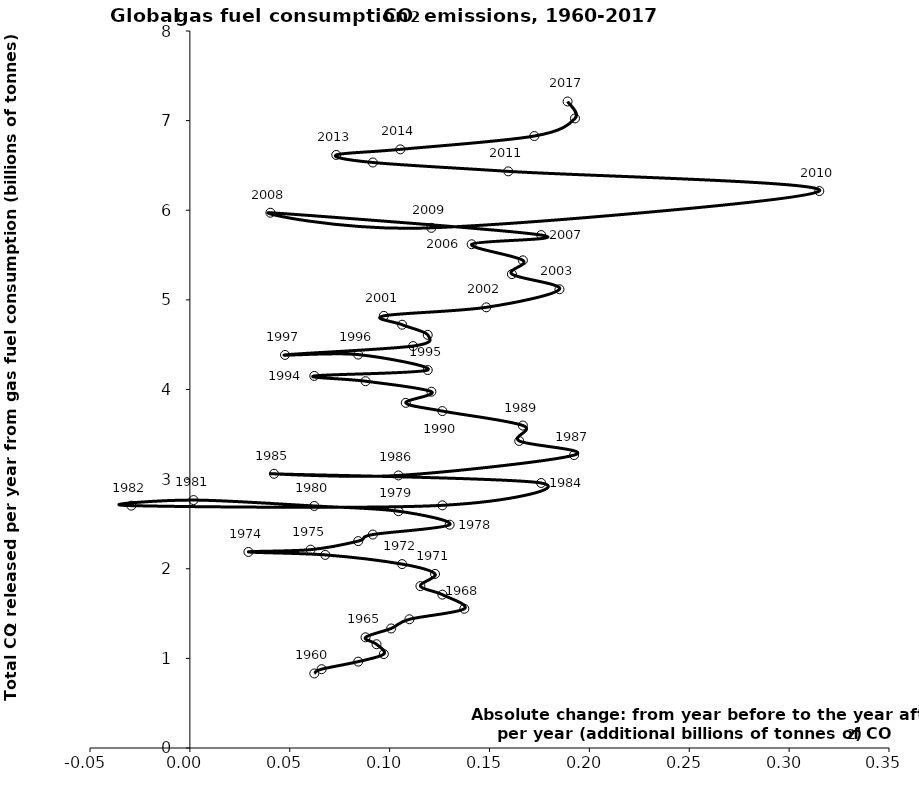
| Category | Series 0 |
|---|---|
| 0.06228800000000001 | 0.832 |
| 0.06595200000000001 | 0.879 |
| 0.08427199999999996 | 0.964 |
| 0.09709599999999996 | 1.048 |
| 0.09343200000000007 | 1.158 |
| 0.08793600000000001 | 1.235 |
| 0.10075999999999996 | 1.334 |
| 0.10992000000000002 | 1.436 |
| 0.13740000000000008 | 1.554 |
| 0.12640799999999996 | 1.711 |
| 0.11541599999999996 | 1.806 |
| 0.12274400000000019 | 1.942 |
| 0.1062559999999999 | 2.052 |
| 0.06778399999999984 | 2.154 |
| 0.029312000000000005 | 2.187 |
| 0.060456000000000065 | 2.213 |
| 0.08427200000000012 | 2.308 |
| 0.09160000000000013 | 2.382 |
| 0.13007199999999997 | 2.492 |
| 0.10442399999999985 | 2.642 |
| 0.06228800000000012 | 2.7 |
| 0.0018320000000000558 | 2.766 |
| -0.029312000000000227 | 2.704 |
| 0.12640800000000008 | 2.708 |
| 0.17587200000000003 | 2.957 |
| 0.04213599999999973 | 3.059 |
| 0.10442400000000007 | 3.041 |
| 0.1923600000000003 | 3.268 |
| 0.16487999999999992 | 3.426 |
| 0.16671199999999997 | 3.598 |
| 0.12640800000000008 | 3.759 |
| 0.10808799999999974 | 3.851 |
| 0.12091199999999991 | 3.975 |
| 0.08793600000000001 | 4.093 |
| 0.06228800000000012 | 4.151 |
| 0.11907999999999985 | 4.217 |
| 0.08427200000000035 | 4.389 |
| 0.04763200000000012 | 4.386 |
| 0.11175199999999963 | 4.485 |
| 0.11907999999999985 | 4.609 |
| 0.10625600000000013 | 4.723 |
| 0.09709600000000052 | 4.822 |
| 0.14839199999999986 | 4.917 |
| 0.18503200000000009 | 5.119 |
| 0.16121600000000047 | 5.287 |
| 0.16671199999999997 | 5.441 |
| 0.14106399999999963 | 5.621 |
| 0.17587199999999958 | 5.723 |
| 0.04030400000000034 | 5.972 |
| 0.12091200000000013 | 5.804 |
| 0.31510399999999983 | 6.214 |
| 0.15938399999999975 | 6.434 |
| 0.09160000000000013 | 6.533 |
| 0.07328000000000046 | 6.617 |
| 0.10533804807132441 | 6.679 |
| 0.17245432284107798 | 6.828 |
| 0.19280509100232512 | 7.024 |
| 0.18908963246514343 | 7.213 |